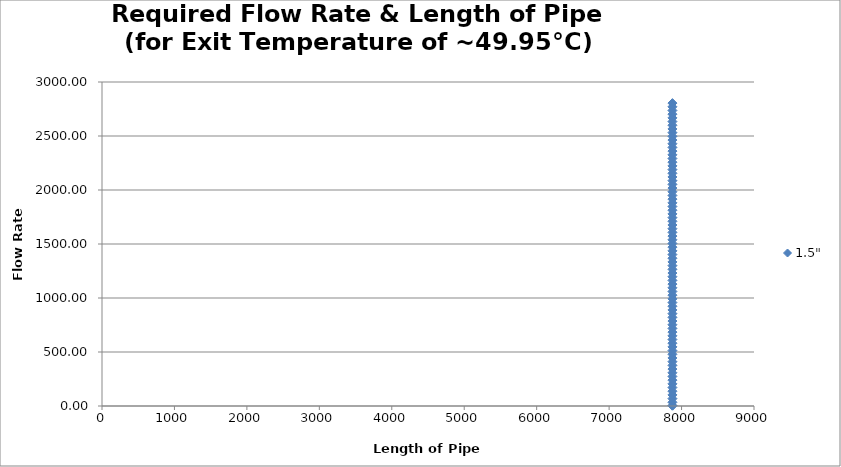
| Category | 1.5" |
|---|---|
| 7874.01576 | 3.01 |
| 7874.01576 | 3.42 |
| 7874.01576 | 34.203 |
| 7874.01576 | 68.406 |
| 7874.01576 | 102.608 |
| 7874.01576 | 136.811 |
| 7874.01576 | 171.014 |
| 7874.01576 | 205.217 |
| 7874.01576 | 239.419 |
| 7874.01576 | 273.622 |
| 7874.01576 | 307.825 |
| 7874.01576 | 342.028 |
| 7874.01576 | 376.23 |
| 7874.01576 | 410.433 |
| 7874.01576 | 444.636 |
| 7874.01576 | 478.839 |
| 7874.01576 | 513.041 |
| 7874.01576 | 547.244 |
| 7874.01576 | 581.447 |
| 7874.01576 | 615.65 |
| 7874.01576 | 649.852 |
| 7874.01576 | 684.055 |
| 7874.01576 | 718.258 |
| 7874.01576 | 752.461 |
| 7874.01576 | 786.663 |
| 7874.01576 | 820.866 |
| 7874.01576 | 855.069 |
| 7874.01576 | 889.272 |
| 7874.01576 | 923.474 |
| 7874.01576 | 957.677 |
| 7874.01576 | 991.88 |
| 7874.01576 | 1026.083 |
| 7874.01576 | 1060.285 |
| 7874.01576 | 1094.488 |
| 7874.01576 | 1128.691 |
| 7874.01576 | 1162.894 |
| 7874.01576 | 1197.096 |
| 7874.01576 | 1231.299 |
| 7874.01576 | 1265.502 |
| 7874.01576 | 1299.705 |
| 7874.01576 | 1333.907 |
| 7874.01576 | 1368.11 |
| 7874.01576 | 1402.313 |
| 7874.01576 | 1436.516 |
| 7874.01576 | 1470.718 |
| 7874.01576 | 1504.921 |
| 7874.01576 | 1539.124 |
| 7874.01576 | 1573.327 |
| 7874.01576 | 1607.529 |
| 7874.01576 | 1641.732 |
| 7874.01576 | 1675.935 |
| 7874.01576 | 1710.138 |
| 7874.01576 | 1744.341 |
| 7874.01576 | 1778.543 |
| 7874.01576 | 1812.746 |
| 7874.01576 | 1846.949 |
| 7874.01576 | 1881.152 |
| 7874.01576 | 1915.354 |
| 7874.01576 | 1949.557 |
| 7874.01576 | 1983.76 |
| 7874.01576 | 2017.963 |
| 7874.01576 | 2052.165 |
| 7874.01576 | 2086.368 |
| 7874.01576 | 2120.571 |
| 7874.01576 | 2154.774 |
| 7874.01576 | 2188.976 |
| 7874.01576 | 2223.179 |
| 7874.01576 | 2257.382 |
| 7874.01576 | 2291.585 |
| 7874.01576 | 2325.787 |
| 7874.01576 | 2359.99 |
| 7874.01576 | 2394.193 |
| 7874.01576 | 2428.396 |
| 7874.01576 | 2462.598 |
| 7874.01576 | 2496.801 |
| 7874.01576 | 2531.004 |
| 7874.01576 | 2565.207 |
| 7874.01576 | 2599.409 |
| 7874.01576 | 2633.612 |
| 7874.01576 | 2667.815 |
| 7874.01576 | 2702.018 |
| 7874.01576 | 2736.22 |
| 7874.01576 | 2770.423 |
| 7874.01576 | 2804.626 |